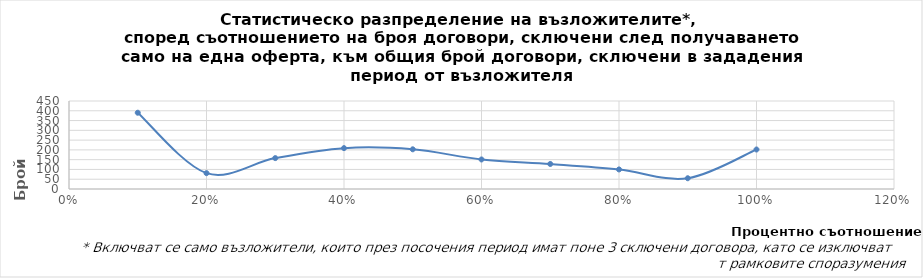
| Category | Series 0 |
|---|---|
| 0.1 | 390 |
| 0.2 | 81 |
| 0.3 | 158 |
| 0.4 | 209 |
| 0.5 | 203 |
| 0.6 | 151 |
| 0.7 | 128 |
| 0.8 | 100 |
| 0.9 | 55 |
| 1.0 | 202 |